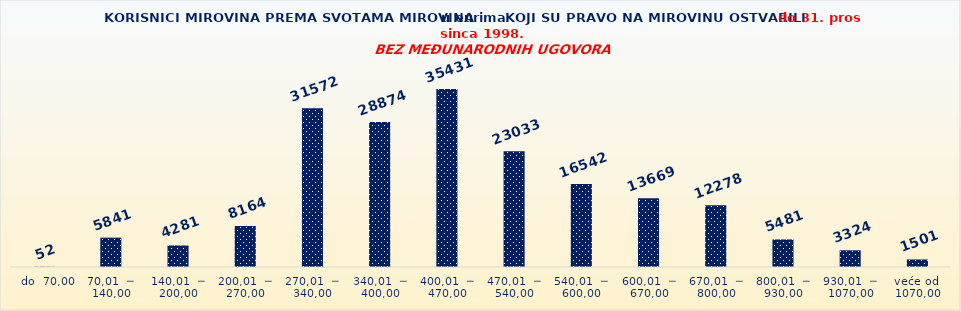
| Category | Series 0 |
|---|---|
|   do  70,00 | 52 |
| 70,01  ─  140,00 | 5841 |
| 140,01  ─  200,00 | 4281 |
| 200,01  ─  270,00 | 8164 |
| 270,01  ─  340,00 | 31572 |
| 340,01  ─  400,00 | 28874 |
| 400,01  ─  470,00 | 35431 |
| 470,01  ─  540,00 | 23033 |
| 540,01  ─  600,00 | 16542 |
| 600,01  ─  670,00 | 13669 |
| 670,01  ─  800,00 | 12278 |
| 800,01  ─  930,00 | 5481 |
| 930,01  ─  1070,00 | 3324 |
| veće od  1070,00 | 1501 |